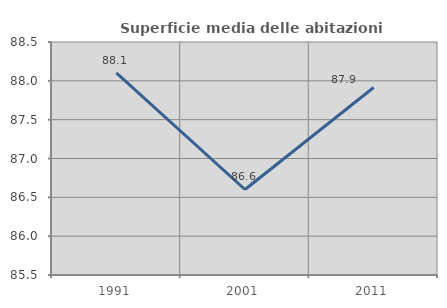
| Category | Superficie media delle abitazioni occupate |
|---|---|
| 1991.0 | 88.101 |
| 2001.0 | 86.601 |
| 2011.0 | 87.914 |